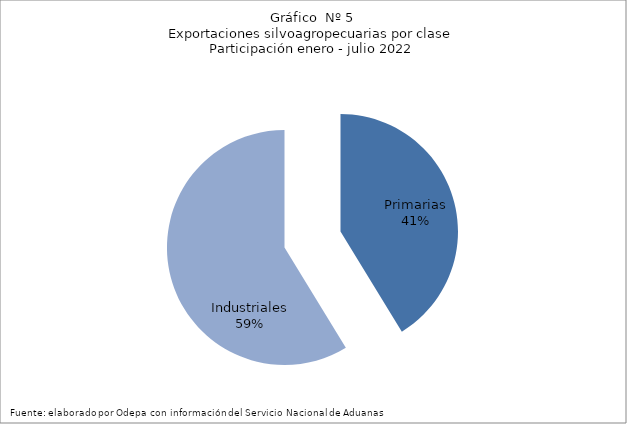
| Category | Series 0 |
|---|---|
| Primarias | 4899423 |
| Industriales | 6975709 |